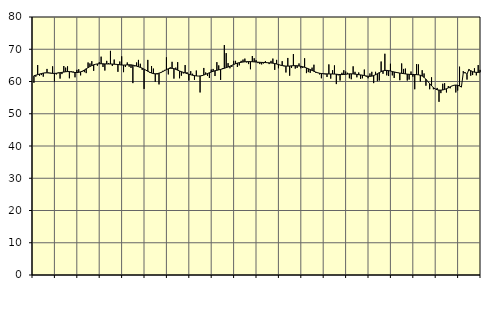
| Category | Piggar | Series 1 |
|---|---|---|
| nan | 59.6 | 61.78 |
| 1.0 | 61.5 | 61.96 |
| 1.0 | 65.1 | 62.12 |
| 1.0 | 61.8 | 62.31 |
| 1.0 | 62 | 62.46 |
| 1.0 | 61.5 | 62.61 |
| 1.0 | 62.6 | 62.69 |
| 1.0 | 63.9 | 62.69 |
| 1.0 | 62.8 | 62.63 |
| 1.0 | 62.7 | 62.57 |
| 1.0 | 64.7 | 62.52 |
| 1.0 | 60 | 62.51 |
| nan | 62.2 | 62.55 |
| 2.0 | 62.8 | 62.63 |
| 2.0 | 60.9 | 62.73 |
| 2.0 | 62.3 | 62.83 |
| 2.0 | 64.8 | 62.93 |
| 2.0 | 64.3 | 63.03 |
| 2.0 | 64.7 | 63.08 |
| 2.0 | 61 | 63.07 |
| 2.0 | 63.2 | 62.99 |
| 2.0 | 63.1 | 62.88 |
| 2.0 | 61.3 | 62.79 |
| 2.0 | 63.6 | 62.77 |
| nan | 63.8 | 62.84 |
| 3.0 | 61.9 | 62.99 |
| 3.0 | 63.1 | 63.24 |
| 3.0 | 62.9 | 63.57 |
| 3.0 | 62.6 | 63.94 |
| 3.0 | 65.9 | 64.3 |
| 3.0 | 65.6 | 64.64 |
| 3.0 | 66.3 | 64.93 |
| 3.0 | 63.3 | 65.17 |
| 3.0 | 65.3 | 65.34 |
| 3.0 | 64.9 | 65.45 |
| 3.0 | 66 | 65.51 |
| nan | 67.7 | 65.51 |
| 4.0 | 64.5 | 65.48 |
| 4.0 | 63.4 | 65.46 |
| 4.0 | 66.4 | 65.44 |
| 4.0 | 65.7 | 65.43 |
| 4.0 | 69.5 | 65.43 |
| 4.0 | 64.8 | 65.4 |
| 4.0 | 66.8 | 65.36 |
| 4.0 | 65.3 | 65.32 |
| 4.0 | 63 | 65.26 |
| 4.0 | 66.2 | 65.19 |
| 4.0 | 67.8 | 65.12 |
| nan | 62.9 | 65.09 |
| 5.0 | 64.5 | 65.11 |
| 5.0 | 65.9 | 65.16 |
| 5.0 | 64.6 | 65.19 |
| 5.0 | 64.2 | 65.16 |
| 5.0 | 59.5 | 65.08 |
| 5.0 | 64.7 | 64.94 |
| 5.0 | 65.9 | 64.77 |
| 5.0 | 66.7 | 64.58 |
| 5.0 | 65.5 | 64.37 |
| 5.0 | 63.6 | 64.13 |
| 5.0 | 57.7 | 63.85 |
| nan | 63.5 | 63.52 |
| 6.0 | 66.7 | 63.18 |
| 6.0 | 62.7 | 62.88 |
| 6.0 | 64.8 | 62.62 |
| 6.0 | 64 | 62.45 |
| 6.0 | 59.9 | 62.4 |
| 6.0 | 62.2 | 62.44 |
| 6.0 | 59.1 | 62.58 |
| 6.0 | 62.9 | 62.79 |
| 6.0 | 63.3 | 63.07 |
| 6.0 | 63.6 | 63.38 |
| 6.0 | 67.5 | 63.68 |
| nan | 62.2 | 63.95 |
| 7.0 | 64.4 | 64.1 |
| 7.0 | 66.1 | 64.1 |
| 7.0 | 60.9 | 63.99 |
| 7.0 | 64.3 | 63.77 |
| 7.0 | 66 | 63.51 |
| 7.0 | 61 | 63.26 |
| 7.0 | 61.8 | 63.04 |
| 7.0 | 62.5 | 62.84 |
| 7.0 | 65.1 | 62.65 |
| 7.0 | 62.9 | 62.46 |
| 7.0 | 60.3 | 62.27 |
| nan | 63.2 | 62.09 |
| 8.0 | 62.4 | 61.94 |
| 8.0 | 60.5 | 61.82 |
| 8.0 | 63.4 | 61.73 |
| 8.0 | 61.7 | 61.69 |
| 8.0 | 56.6 | 61.72 |
| 8.0 | 62 | 61.82 |
| 8.0 | 64.2 | 62 |
| 8.0 | 62.8 | 62.23 |
| 8.0 | 61.7 | 62.47 |
| 8.0 | 61.1 | 62.71 |
| 8.0 | 63.7 | 62.95 |
| nan | 63.9 | 63.16 |
| 9.0 | 61.7 | 63.33 |
| 9.0 | 66 | 63.47 |
| 9.0 | 65 | 63.61 |
| 9.0 | 60.5 | 63.75 |
| 9.0 | 64.1 | 63.92 |
| 9.0 | 71.3 | 64.1 |
| 9.0 | 68.8 | 64.29 |
| 9.0 | 65.7 | 64.49 |
| 9.0 | 64.1 | 64.74 |
| 9.0 | 64.5 | 65.01 |
| 9.0 | 66.4 | 65.27 |
| nan | 66.4 | 65.51 |
| 10.0 | 64.5 | 65.7 |
| 10.0 | 65 | 65.84 |
| 10.0 | 66.4 | 65.95 |
| 10.0 | 66.8 | 66.04 |
| 10.0 | 67.1 | 66.11 |
| 10.0 | 65.9 | 66.15 |
| 10.0 | 65.4 | 66.17 |
| 10.0 | 63.8 | 66.16 |
| 10.0 | 67.9 | 66.13 |
| 10.0 | 67.2 | 66.09 |
| 10.0 | 66.6 | 66.04 |
| nan | 65.7 | 65.99 |
| 11.0 | 65.4 | 65.95 |
| 11.0 | 65.3 | 65.92 |
| 11.0 | 65.6 | 65.9 |
| 11.0 | 66.3 | 65.87 |
| 11.0 | 65.9 | 65.83 |
| 11.0 | 65.4 | 65.79 |
| 11.0 | 66.4 | 65.75 |
| 11.0 | 67.1 | 65.68 |
| 11.0 | 63.6 | 65.58 |
| 11.0 | 66.7 | 65.43 |
| 11.0 | 64.1 | 65.26 |
| nan | 65 | 65.09 |
| 12.0 | 66.3 | 64.95 |
| 12.0 | 64.7 | 64.85 |
| 12.0 | 62.8 | 64.78 |
| 12.0 | 67.3 | 64.77 |
| 12.0 | 61.8 | 64.8 |
| 12.0 | 64.2 | 64.86 |
| 12.0 | 68.5 | 64.9 |
| 12.0 | 64 | 64.91 |
| 12.0 | 64.2 | 64.88 |
| 12.0 | 65.6 | 64.82 |
| 12.0 | 64.1 | 64.72 |
| nan | 64.2 | 64.58 |
| 13.0 | 67.2 | 64.41 |
| 13.0 | 62.6 | 64.2 |
| 13.0 | 62.9 | 63.96 |
| 13.0 | 62.7 | 63.71 |
| 13.0 | 64.3 | 63.44 |
| 13.0 | 65.2 | 63.17 |
| 13.0 | 62.7 | 62.92 |
| 13.0 | 62.8 | 62.7 |
| 13.0 | 62.2 | 62.56 |
| 13.0 | 61 | 62.47 |
| 13.0 | 62.3 | 62.42 |
| nan | 62.2 | 62.39 |
| 14.0 | 61.4 | 62.36 |
| 14.0 | 65.3 | 62.34 |
| 14.0 | 60.9 | 62.34 |
| 14.0 | 63.5 | 62.33 |
| 14.0 | 65 | 62.31 |
| 14.0 | 59.2 | 62.26 |
| 14.0 | 61.9 | 62.19 |
| 14.0 | 60.3 | 62.15 |
| 14.0 | 62.7 | 62.15 |
| 14.0 | 63.5 | 62.18 |
| 14.0 | 63.1 | 62.24 |
| nan | 62.7 | 62.31 |
| 15.0 | 61 | 62.37 |
| 15.0 | 60.7 | 62.38 |
| 15.0 | 64.7 | 62.35 |
| 15.0 | 63 | 62.29 |
| 15.0 | 61.3 | 62.21 |
| 15.0 | 62.8 | 62.12 |
| 15.0 | 60.8 | 62.04 |
| 15.0 | 61 | 61.96 |
| 15.0 | 63.7 | 61.85 |
| 15.0 | 61.5 | 61.72 |
| 15.0 | 61 | 61.63 |
| nan | 62.5 | 61.6 |
| 16.0 | 63 | 61.66 |
| 16.0 | 59.5 | 61.84 |
| 16.0 | 63 | 62.11 |
| 16.0 | 60.1 | 62.42 |
| 16.0 | 60.3 | 62.75 |
| 16.0 | 66.2 | 63.06 |
| 16.0 | 62.4 | 63.29 |
| 16.0 | 68.6 | 63.42 |
| 16.0 | 61.9 | 63.44 |
| 16.0 | 61.7 | 63.38 |
| 16.0 | 65.5 | 63.26 |
| nan | 61.9 | 63.1 |
| 17.0 | 61.1 | 62.96 |
| 17.0 | 62.7 | 62.83 |
| 17.0 | 62.8 | 62.71 |
| 17.0 | 60.4 | 62.61 |
| 17.0 | 65.6 | 62.53 |
| 17.0 | 63.9 | 62.45 |
| 17.0 | 64 | 62.36 |
| 17.0 | 60.3 | 62.28 |
| 17.0 | 60.6 | 62.22 |
| 17.0 | 63.1 | 62.19 |
| 17.0 | 61.5 | 62.18 |
| nan | 57.6 | 62.16 |
| 18.0 | 65.4 | 62.13 |
| 18.0 | 65.3 | 62.07 |
| 18.0 | 60 | 61.94 |
| 18.0 | 63.5 | 61.69 |
| 18.0 | 62.5 | 61.28 |
| 18.0 | 58.7 | 60.71 |
| 18.0 | 60.1 | 60.03 |
| 18.0 | 57.6 | 59.32 |
| 18.0 | 61.3 | 58.65 |
| 18.0 | 57.6 | 58.09 |
| 18.0 | 57.7 | 57.67 |
| nan | 58 | 57.44 |
| 19.0 | 53.7 | 57.33 |
| 19.0 | 56.4 | 57.32 |
| 19.0 | 59.3 | 57.38 |
| 19.0 | 59.5 | 57.54 |
| 19.0 | 56.6 | 57.76 |
| 19.0 | 58.6 | 58.04 |
| 19.0 | 57.9 | 58.34 |
| 19.0 | 58.6 | 58.63 |
| 19.0 | 58.8 | 58.83 |
| 19.0 | 56.6 | 58.9 |
| 19.0 | 57.2 | 58.83 |
| nan | 64.6 | 58.61 |
| 20.0 | 58.3 | 58.27 |
| 20.0 | 63.2 | 62.69 |
| 20.0 | 62.9 | 62.73 |
| 20.0 | 60.6 | 62.23 |
| 20.0 | 63.3 | 63.74 |
| 20.0 | 61.8 | 63.35 |
| 20.0 | 62 | 63.07 |
| 20.0 | 64.1 | 62.9 |
| 20.0 | 61.9 | 62.83 |
| 20.0 | 65.1 | 62.83 |
| 20.0 | 63.6 | 62.87 |